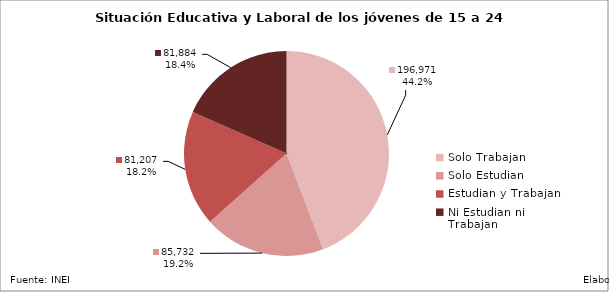
| Category | Series 0 |
|---|---|
| Solo Trabajan | 196970.69 |
| Solo Estudian | 85731.6 |
| Estudian y Trabajan | 81206.83 |
| Ni Estudian ni Trabajan | 81883.5 |